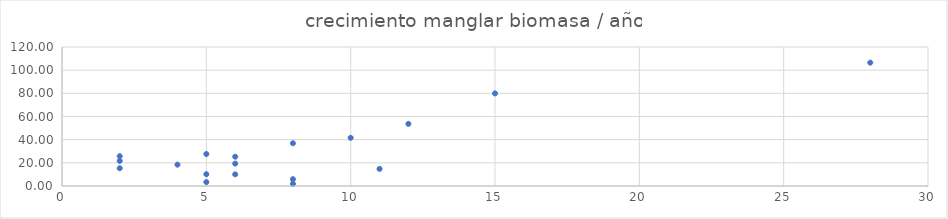
| Category | Series 0 |
|---|---|
| 2.0 | 25.749 |
| 2.0 | 15.348 |
| 2.0 | 21.671 |
| 4.0 | 18.436 |
| 5.0 | 27.6 |
| 8.0 | 36.912 |
| 10.0 | 41.613 |
| 6.0 | 19.353 |
| 6.0 | 10.057 |
| 11.0 | 14.783 |
| 6.0 | 25.291 |
| 5.0 | 10.18 |
| 8.0 | 5.88 |
| 5.0 | 3.366 |
| 8.0 | 1.859 |
| 12.0 | 53.645 |
| 28.0 | 106.478 |
| 15.0 | 79.934 |